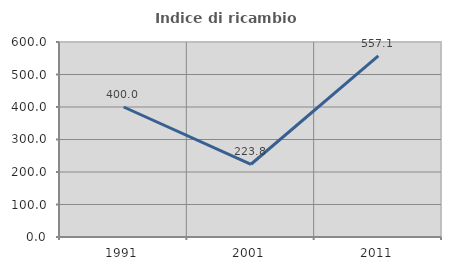
| Category | Indice di ricambio occupazionale  |
|---|---|
| 1991.0 | 400 |
| 2001.0 | 223.81 |
| 2011.0 | 557.143 |